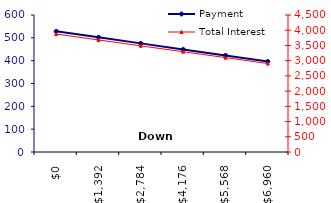
| Category | Payment |
|---|---|
| 0.0 | 528.59 |
| 1392.0500000000002 | 502.16 |
| 2784.1000000000004 | 475.73 |
| 4176.15 | 449.3 |
| 5568.200000000001 | 422.87 |
| 6960.25 | 396.44 |